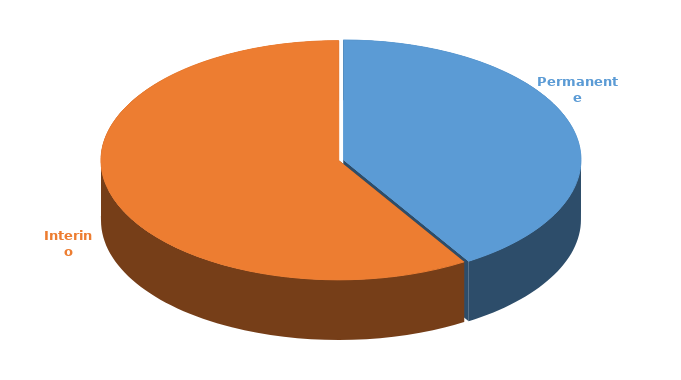
| Category | Cantidad |
|---|---|
| Permanente | 2617 |
| Interino | 3742 |